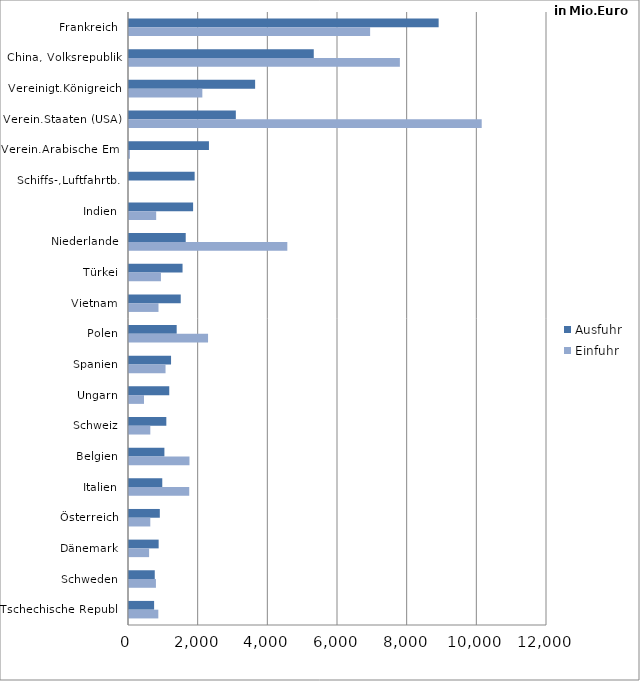
| Category | Ausfuhr | Einfuhr |
|---|---|---|
| Frankreich | 8889.219 | 6922.277 |
| China, Volksrepublik | 5304.198 | 7776.29 |
| Vereinigt.Königreich | 3620.797 | 2105.394 |
| Verein.Staaten (USA) | 3067.023 | 10125.576 |
| Verein.Arabische Em. | 2295.134 | 25.108 |
| Schiffs-,Luftfahrtb. | 1884.487 | 0 |
| Indien | 1840.282 | 780.088 |
| Niederlande | 1628.452 | 4545.138 |
| Türkei | 1537.303 | 917.152 |
| Vietnam | 1485.255 | 846.665 |
| Polen | 1368.94 | 2269.517 |
| Spanien | 1207.304 | 1048.896 |
| Ungarn | 1155.759 | 431.141 |
| Schweiz | 1071.526 | 611.856 |
| Belgien | 1016.244 | 1736.237 |
| Italien | 955.219 | 1729.048 |
| Österreich | 884.678 | 611.408 |
| Dänemark | 851.012 | 577.035 |
| Schweden | 739.569 | 773.131 |
| Tschechische Republ. | 720.938 | 841.729 |